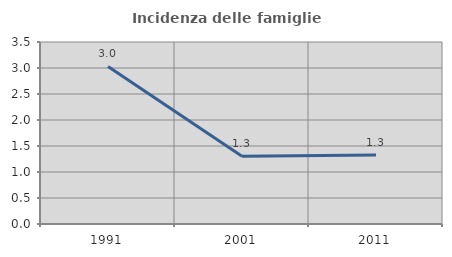
| Category | Incidenza delle famiglie numerose |
|---|---|
| 1991.0 | 3.029 |
| 2001.0 | 1.301 |
| 2011.0 | 1.328 |